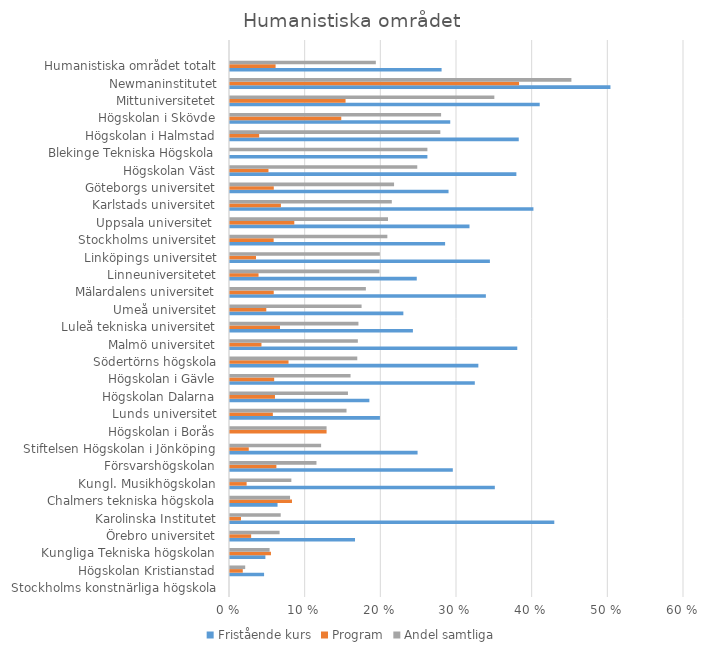
| Category | Fristående kurs | Program | Andel samtliga |
|---|---|---|---|
| Stockholms konstnärliga högskola | 0 | 0 | 0 |
| Högskolan Kristianstad | 0.045 | 0.017 | 0.02 |
| Kungliga Tekniska högskolan | 0.047 | 0.054 | 0.052 |
| Örebro universitet | 0.165 | 0.028 | 0.066 |
| Karolinska Institutet | 0.429 | 0.015 | 0.067 |
| Chalmers tekniska högskola | 0.063 | 0.082 | 0.079 |
| Kungl. Musikhögskolan | 0.35 | 0.022 | 0.081 |
| Försvarshögskolan | 0.294 | 0.061 | 0.114 |
| Stiftelsen Högskolan i Jönköping | 0.248 | 0.025 | 0.12 |
| Högskolan i Borås | 0 | 0.128 | 0.128 |
| Lunds universitet | 0.198 | 0.057 | 0.154 |
| Högskolan Dalarna | 0.184 | 0.059 | 0.156 |
| Högskolan i Gävle | 0.324 | 0.058 | 0.159 |
| Södertörns högskola | 0.328 | 0.077 | 0.168 |
| Malmö universitet | 0.38 | 0.042 | 0.169 |
| Luleå tekniska universitet | 0.242 | 0.066 | 0.17 |
| Umeå universitet | 0.229 | 0.048 | 0.174 |
| Mälardalens universitet | 0.338 | 0.058 | 0.18 |
| Linneuniversitetet | 0.247 | 0.038 | 0.197 |
| Linköpings universitet | 0.343 | 0.034 | 0.198 |
| Stockholms universitet | 0.284 | 0.058 | 0.208 |
| Uppsala universitet  | 0.317 | 0.085 | 0.209 |
| Karlstads universitet | 0.401 | 0.067 | 0.214 |
| Göteborgs universitet | 0.289 | 0.058 | 0.217 |
| Högskolan Väst | 0.378 | 0.051 | 0.247 |
| Blekinge Tekniska Högskola | 0.261 | 0 | 0.261 |
| Högskolan i Halmstad | 0.382 | 0.039 | 0.278 |
| Högskolan i Skövde | 0.291 | 0.147 | 0.279 |
| Mittuniversitetet | 0.409 | 0.153 | 0.349 |
| Newmaninstitutet | 0.503 | 0.382 | 0.451 |
| Humanistiska området totalt | 0.28 | 0.06 | 0.193 |